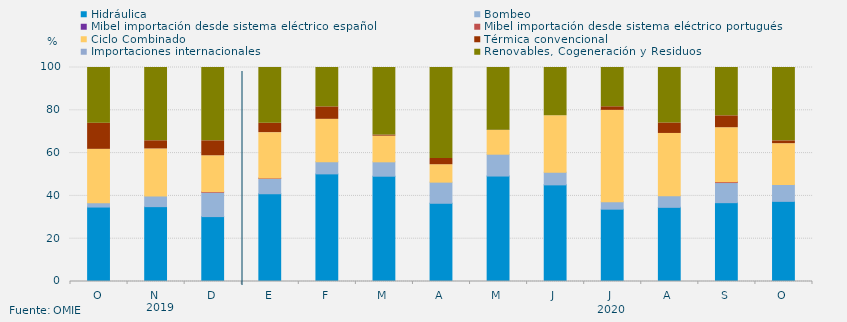
| Category | Hidráulica | Bombeo | Mibel importación desde sistema eléctrico español | Mibel importación desde sistema eléctrico portugués | Ciclo Combinado | Térmica convencional | Importaciones internacionales | Renovables, Cogeneración y Residuos |
|---|---|---|---|---|---|---|---|---|
| O | 34.791 | 1.952 | 0 | 0 | 25.011 | 12.248 | 0 | 25.998 |
| N | 34.979 | 4.937 | 0 | 0 | 22.021 | 3.825 | 0 | 34.237 |
| D | 30.328 | 11.373 | 0 | 0.269 | 16.779 | 6.999 | 0 | 34.253 |
| E | 41.005 | 7.201 | 0 | 0.135 | 21.22 | 4.419 | 0 | 26.021 |
| F | 50.288 | 5.707 | 0 | 0 | 19.784 | 5.827 | 0 | 18.393 |
| M | 49.203 | 6.727 | 0 | 0 | 11.983 | 0.539 | 0 | 31.548 |
| A | 36.555 | 9.875 | 0 | 0 | 8.136 | 2.898 | 0 | 42.536 |
| M | 49.282 | 10.206 | 0 | 0 | 11.081 | 0.135 | 0 | 29.296 |
| J | 45.155 | 5.888 | 0 | 0 | 26.402 | 0 | 0 | 22.554 |
| J | 33.804 | 3.477 | 0 | 0 | 42.687 | 1.682 | 0 | 18.349 |
| A | 34.657 | 5.384 | 0 | 0 | 29.139 | 4.913 | 0 | 25.908 |
| S | 36.834 | 9.411 | 0 | 0.417 | 25.197 | 5.563 | 0 | 22.578 |
| O | 37.45 | 7.852 | 0 | 0 | 19.105 | 1.32 | 0 | 34.273 |